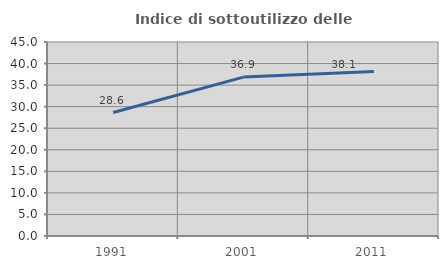
| Category | Indice di sottoutilizzo delle abitazioni  |
|---|---|
| 1991.0 | 28.643 |
| 2001.0 | 36.864 |
| 2011.0 | 38.144 |